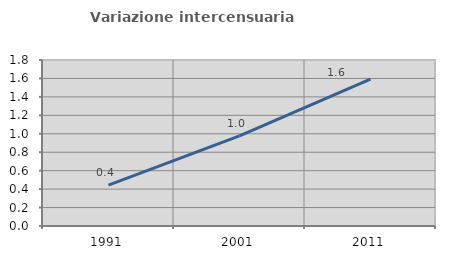
| Category | Variazione intercensuaria annua |
|---|---|
| 1991.0 | 0.444 |
| 2001.0 | 0.977 |
| 2011.0 | 1.593 |